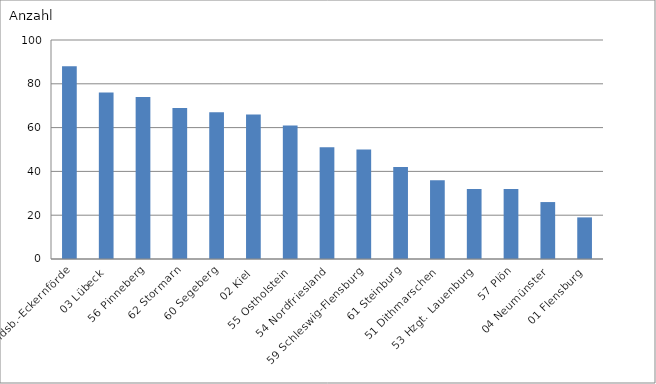
| Category | 58 Rendsb.-Eckernförde |
|---|---|
| 58 Rendsb.-Eckernförde | 88 |
| 03 Lübeck | 76 |
| 56 Pinneberg | 74 |
| 62 Stormarn | 69 |
| 60 Segeberg | 67 |
| 02 Kiel | 66 |
| 55 Ostholstein | 61 |
| 54 Nordfriesland | 51 |
| 59 Schleswig-Flensburg | 50 |
| 61 Steinburg | 42 |
| 51 Dithmarschen | 36 |
| 53 Hzgt. Lauenburg | 32 |
| 57 Plön | 32 |
| 04 Neumünster | 26 |
| 01 Flensburg | 19 |